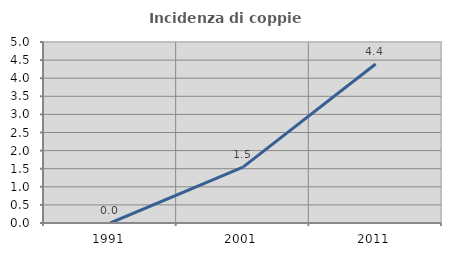
| Category | Incidenza di coppie miste |
|---|---|
| 1991.0 | 0 |
| 2001.0 | 1.542 |
| 2011.0 | 4.394 |